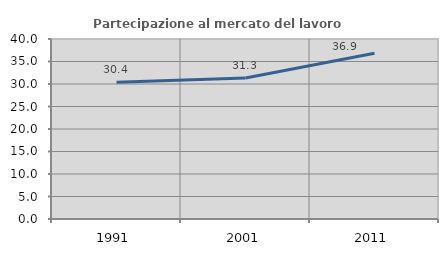
| Category | Partecipazione al mercato del lavoro  femminile |
|---|---|
| 1991.0 | 30.414 |
| 2001.0 | 31.344 |
| 2011.0 | 36.852 |